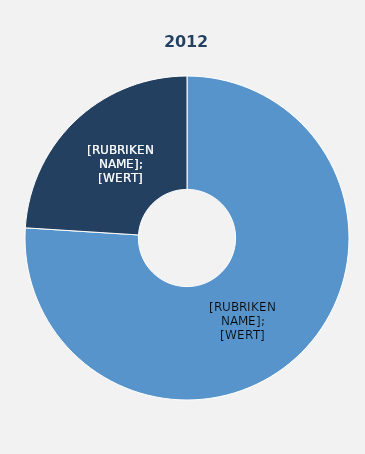
| Category | Series 1 |
|---|---|
| Vollzeitbeschäftigte | 76 |
| Teilzeitbeschäftigte | 24 |